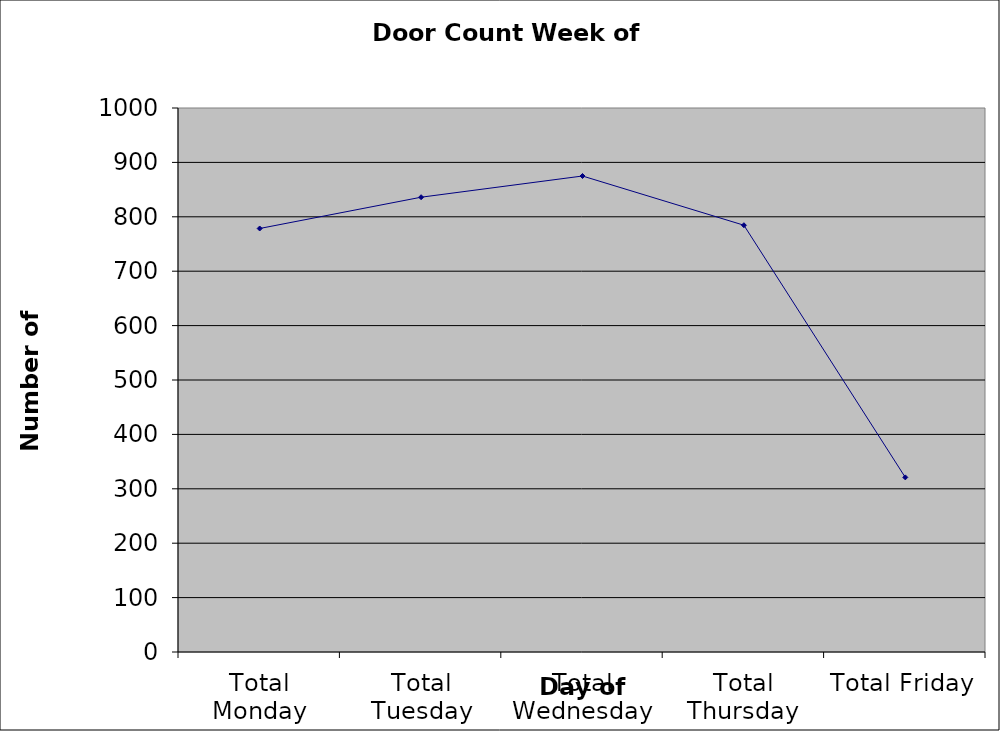
| Category | Series 0 |
|---|---|
| Total Monday | 778.5 |
| Total Tuesday | 836 |
| Total Wednesday | 875 |
| Total Thursday | 784.5 |
| Total Friday | 321 |